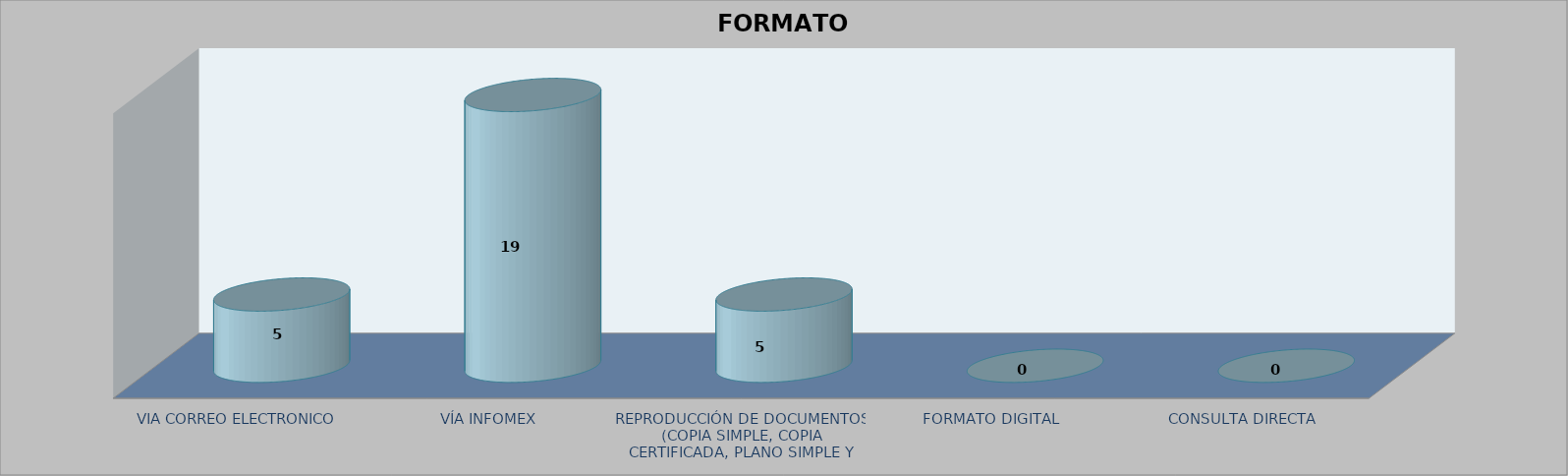
| Category |        FORMATO SOLICITADO | Series 1 | Series 2 |
|---|---|---|---|
| VIA CORREO ELECTRONICO |  |  | 5 |
| VÍA INFOMEX |  |  | 19 |
| REPRODUCCIÓN DE DOCUMENTOS (COPIA SIMPLE, COPIA CERTIFICADA, PLANO SIMPLE Y PLANO CERTIFICADO) |  |  | 5 |
| FORMATO DIGITAL |  |  | 0 |
| CONSULTA DIRECTA |  |  | 0 |